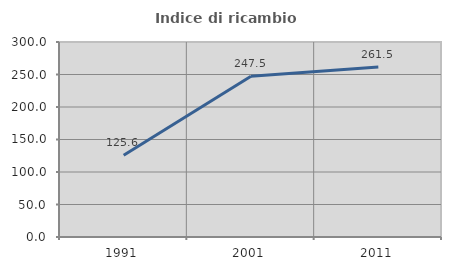
| Category | Indice di ricambio occupazionale  |
|---|---|
| 1991.0 | 125.641 |
| 2001.0 | 247.458 |
| 2011.0 | 261.538 |